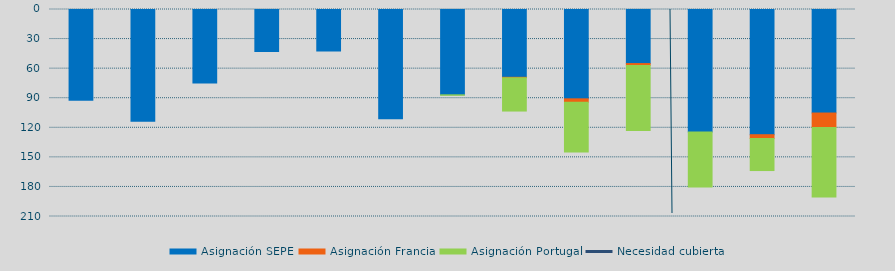
| Category | Asignación SEPE | Asignación Francia | Asignación Portugal |
|---|---|---|---|
| M | 91958.7 | 0 | 0 |
| A | 113400 | 0 | 0 |
| M | 74600 | 0 | 0 |
| J | 42509 | 0 | 0 |
| J | 42214 | 0 | 0 |
| A | 110725 | 0 | 0 |
| S | 86576 | 0 | 437 |
| O | 68790.4 | 478.1 | 33750 |
| N | 90630.9 | 3513 | 50471 |
| D | 54862.4 | 1882.3 | 66113.3 |
| E | 124168 | 0 | 55888.5 |
| F | 127032.4 | 3833.9 | 32519.8 |
| M | 105026.4 | 14708.8 | 70500 |